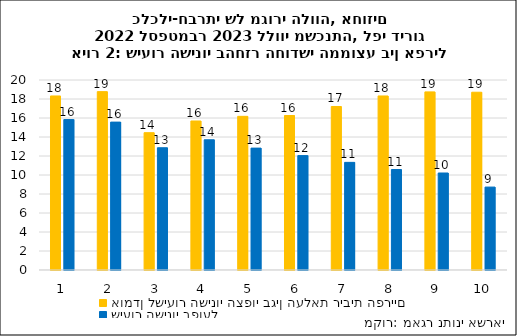
| Category | אומדן לשיעור השינוי הצפוי בגין העלאת ריבית הפריים | שיעור השינוי בפועל |
|---|---|---|
| 1.0 | 18.32 | 15.834 |
| 2.0 | 18.776 | 15.567 |
| 3.0 | 14.455 | 12.87 |
| 4.0 | 15.684 | 13.707 |
| 5.0 | 16.176 | 12.829 |
| 6.0 | 16.262 | 12.042 |
| 7.0 | 17.212 | 11.33 |
| 8.0 | 18.32 | 10.574 |
| 9.0 | 18.749 | 10.21 |
| 10.0 | 18.714 | 8.728 |